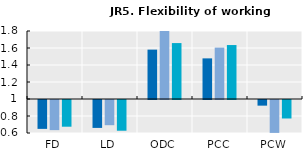
| Category | 2005 | 2010 | 2015 |
|---|---|---|---|
| FD | 0.66 | 0.646 | 0.686 |
| LD | 0.672 | 0.704 | 0.638 |
| ODC | 1.581 | 1.801 | 1.658 |
| PCC | 1.478 | 1.605 | 1.635 |
| PCW | 0.934 | 0.613 | 0.783 |